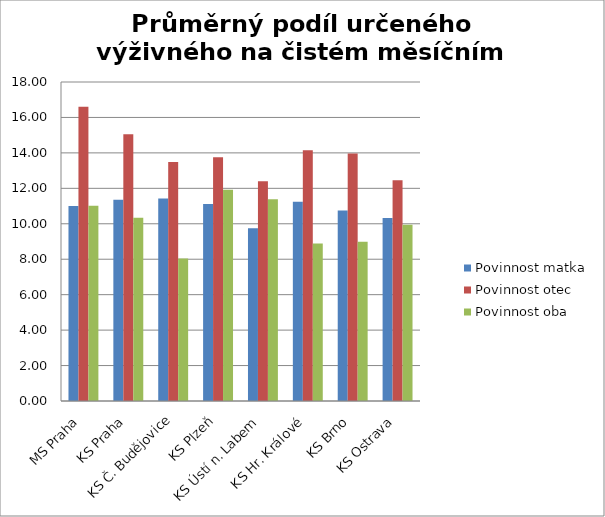
| Category | Povinnost matka | Povinnost otec | Povinnost oba |
|---|---|---|---|
| MS Praha | 11 | 16.61 | 11.02 |
| KS Praha | 11.36 | 15.05 | 10.34 |
| KS Č. Budějovice | 11.42 | 13.48 | 8.04 |
| KS Plzeň | 11.12 | 13.75 | 11.92 |
| KS Ústí n. Labem | 9.75 | 12.4 | 11.38 |
| KS Hr. Králové | 11.24 | 14.15 | 8.89 |
| KS Brno | 10.75 | 13.97 | 8.98 |
| KS Ostrava | 10.32 | 12.46 | 9.95 |